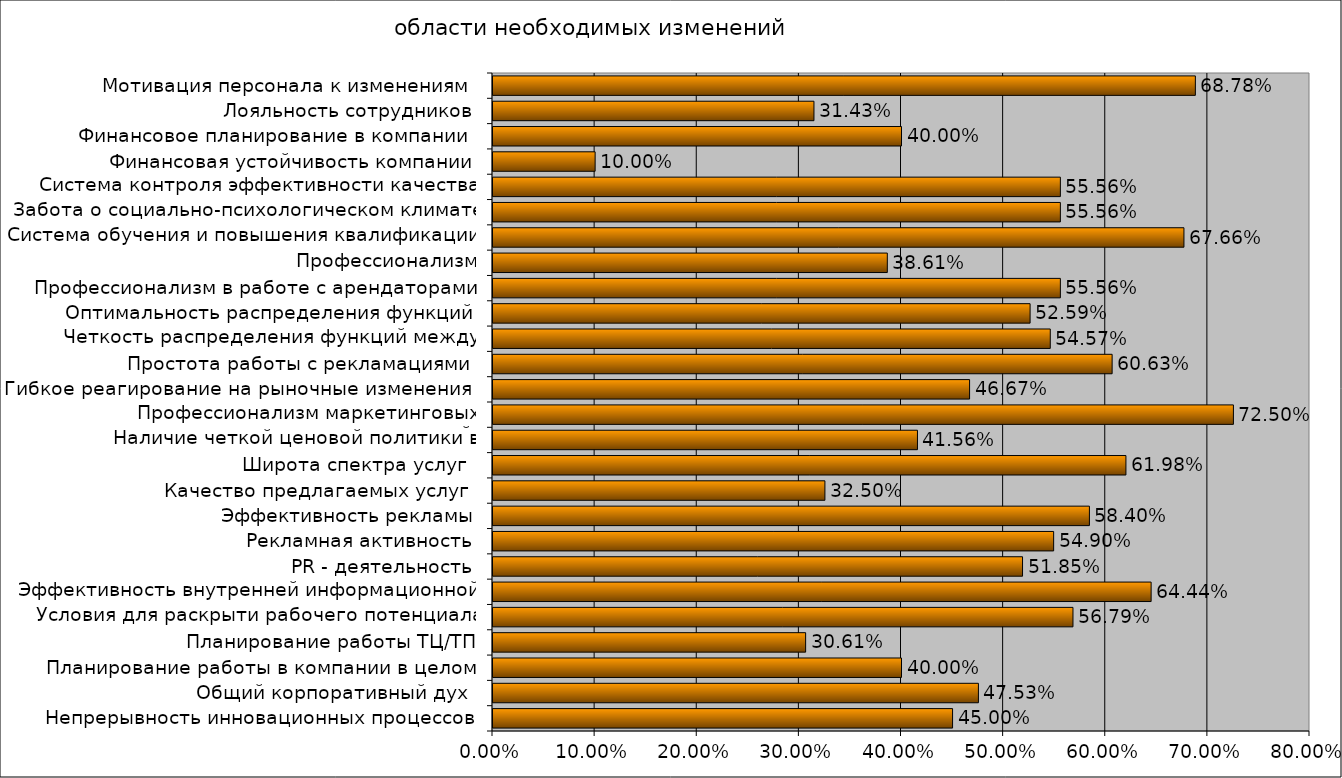
| Category | Series 0 |
|---|---|
| Непрерывность инновационных процессов | 0.45 |
| Общий корпоративный дух  | 0.475 |
| Планирование работы в компании в целом | 0.4 |
| Планирование работы ТЦ/ТП | 0.306 |
| Условия для раскрыти рабочего потенциала каждого сотрудника | 0.568 |
| Эффективность внутренней информационной системы  | 0.644 |
| PR - деятельность | 0.519 |
| Рекламная активность | 0.549 |
| Эффективность рекламы | 0.584 |
| Качество предлагаемых услуг  | 0.325 |
| Широта спектра услуг  | 0.62 |
| Наличие четкой ценовой политики в зависимости от значимости арендаторов | 0.416 |
| Профессионализм маркетинговых исследований  | 0.725 |
| Гибкое реагирование на рыночные изменения  | 0.467 |
| Простота работы с рекламациями  | 0.606 |
| Четкость распределения функций между сотрудниками | 0.546 |
| Оптимальность распределения функций | 0.526 |
| Профессионализм в работе с арендаторами | 0.556 |
| Профессионализм административно-управленческого персонала (офис) | 0.386 |
| Система обучения и повышения квалификации персонала | 0.677 |
| Забота о социально-психологическом климате в компании | 0.556 |
| Система контроля эффективности качества труда персонала | 0.556 |
| Финансовая устойчивость компании | 0.1 |
| Финансовое планирование в компании  | 0.4 |
| Лояльность сотрудников | 0.314 |
| Мотивация персонала к изменениям  | 0.688 |